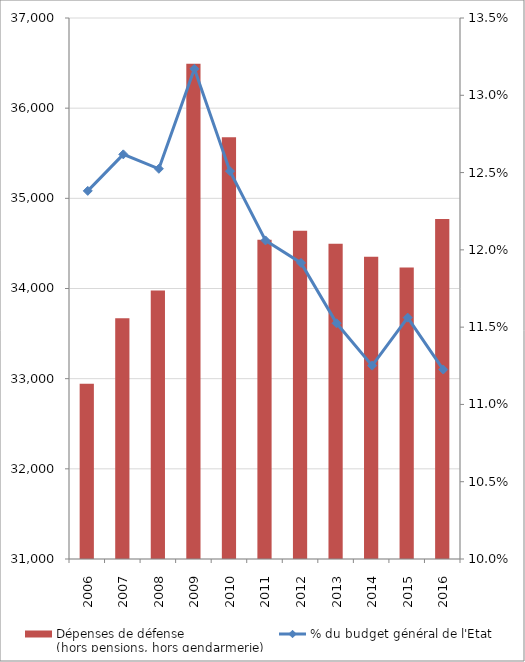
| Category | Dépenses de défense
(hors pensions, hors gendarmerie) |
|---|---|
| 2006.0 | 32944.534 |
| 2007.0 | 33670.863 |
| 2008.0 | 33977.072 |
| 2009.0 | 36493.324 |
| 2010.0 | 35677.958 |
| 2011.0 | 34541.386 |
| 2012.0 | 34639.677 |
| 2013.0 | 34496.377 |
| 2014.0 | 34350.997 |
| 2015.0 | 34232.969 |
| 2016.0 | 34769.946 |